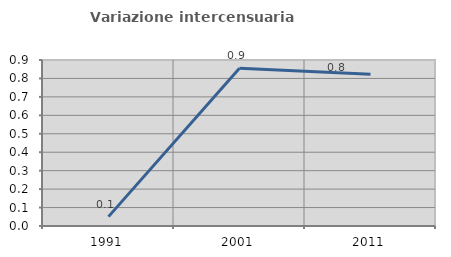
| Category | Variazione intercensuaria annua |
|---|---|
| 1991.0 | 0.051 |
| 2001.0 | 0.856 |
| 2011.0 | 0.823 |